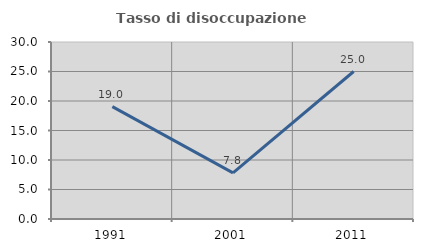
| Category | Tasso di disoccupazione giovanile  |
|---|---|
| 1991.0 | 19.048 |
| 2001.0 | 7.812 |
| 2011.0 | 25 |